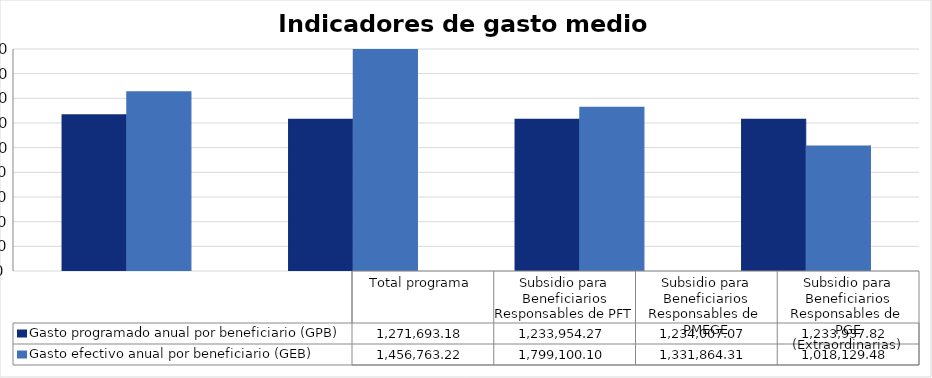
| Category | Gasto programado anual por beneficiario (GPB)  | Gasto efectivo anual por beneficiario (GEB)  |
|---|---|---|
| Total programa | 1271693.176 | 1456763.218 |
| Subsidio para Beneficiarios Responsables de PFT | 1233954.265 | 1799100.096 |
| Subsidio para Beneficiarios Responsables de  PMEGE | 1234007.074 | 1331864.315 |
| Subsidio para Beneficiarios Responsables de  PGE (Extraordinarias) | 1233937.824 | 1018129.48 |